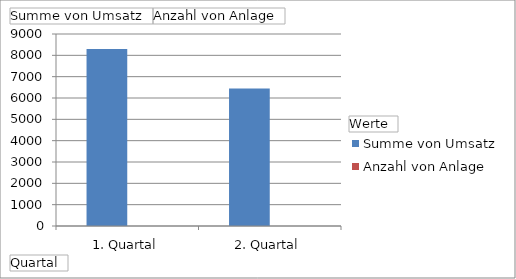
| Category | Summe von Umsatz | Anzahl von Anlage |
|---|---|---|
| 1. Quartal | 8300 | 5 |
| 2. Quartal | 6450 | 4 |